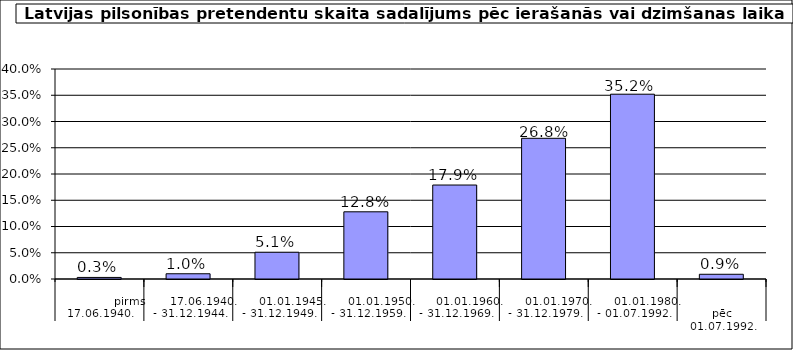
| Category | Series 0 |
|---|---|
|              pirms 17.06.1940. | 0.003 |
|       17.06.1940. - 31.12.1944. | 0.01 |
|       01.01.1945. - 31.12.1949. | 0.051 |
|       01.01.1950. - 31.12.1959. | 0.128 |
|       01.01.1960. - 31.12.1969. | 0.179 |
|       01.01.1970. - 31.12.1979. | 0.268 |
|       01.01.1980. - 01.07.1992. | 0.352 |
|                      pēc 01.07.1992. | 0.009 |